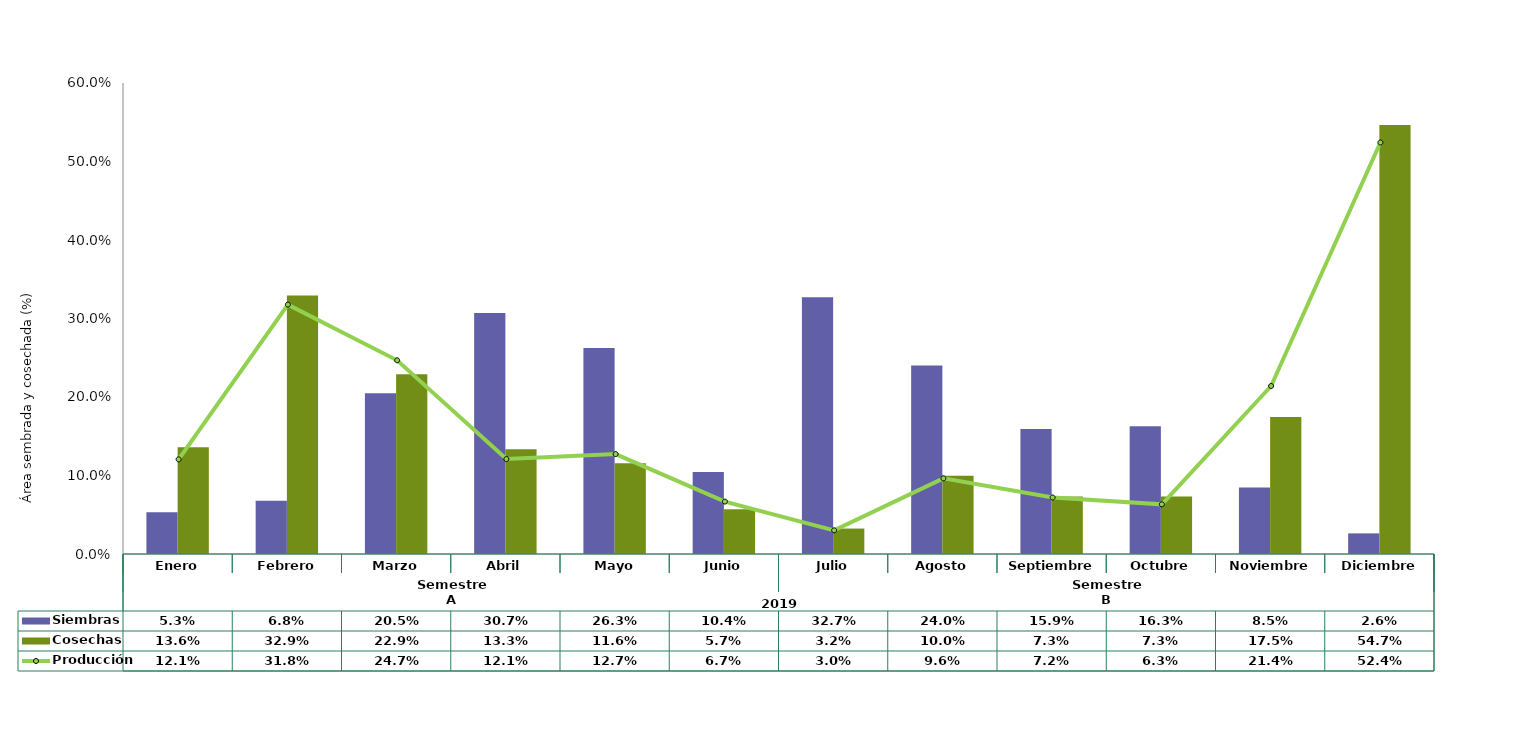
| Category | Siembras | Cosechas   |
|---|---|---|
| 0 | 0.053 | 0.136 |
| 1 | 0.068 | 0.329 |
| 2 | 0.205 | 0.229 |
| 3 | 0.307 | 0.133 |
| 4 | 0.263 | 0.116 |
| 5 | 0.104 | 0.057 |
| 6 | 0.327 | 0.032 |
| 7 | 0.24 | 0.1 |
| 8 | 0.159 | 0.073 |
| 9 | 0.163 | 0.073 |
| 10 | 0.085 | 0.175 |
| 11 | 0.026 | 0.547 |